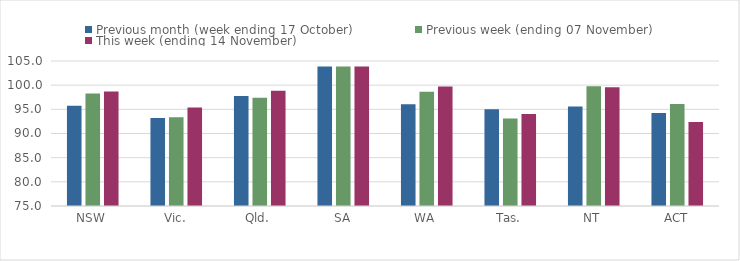
| Category | Previous month (week ending 17 October) | Previous week (ending 07 November) | This week (ending 14 November) |
|---|---|---|---|
| NSW | 95.74 | 98.3 | 98.7 |
| Vic. | 93.19 | 93.36 | 95.38 |
| Qld. | 97.75 | 97.38 | 98.86 |
| SA | 103.85 | 103.85 | 103.85 |
| WA | 96.07 | 98.62 | 99.74 |
| Tas. | 95.03 | 93.12 | 94.06 |
| NT | 95.6 | 99.77 | 99.59 |
| ACT | 94.23 | 96.09 | 92.36 |